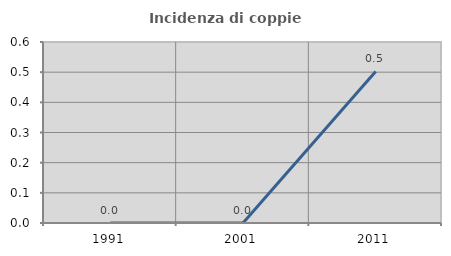
| Category | Incidenza di coppie miste |
|---|---|
| 1991.0 | 0 |
| 2001.0 | 0 |
| 2011.0 | 0.503 |